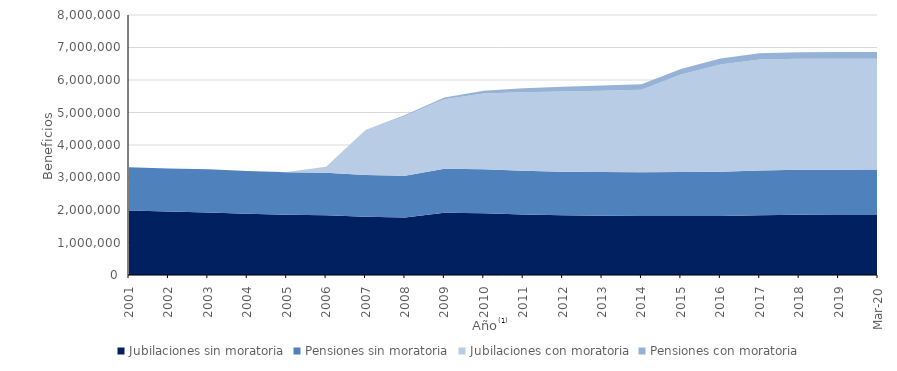
| Category | Jubilaciones sin moratoria | Pensiones sin moratoria | Jubilaciones con moratoria | Pensiones con moratoria |
|---|---|---|---|---|
| 2001.0 | 1984588 | 1327098 | 0 | 0 |
| 2002.0 | 1953410 | 1327077 | 0 | 0 |
| 2003.0 | 1925531 | 1327478 | 0 | 0 |
| 2004.0 | 1881671 | 1319835 | 0 | 0 |
| 2005.0 | 1852155 | 1308369 | 8249 | 0 |
| 2006.0 | 1842055 | 1302065 | 189380 | 536 |
| 2007.0 | 1790012 | 1285210 | 1377788 | 7345 |
| 2008.0 | 1771744 | 1283423 | 1839418 | 24810 |
| 2009.0 | 1916020 | 1353042 | 2137646 | 54755 |
| 2010.0 | 1899422 | 1357224 | 2324976 | 90525 |
| 2011.0 | 1865138 | 1345193 | 2416197 | 122329 |
| 2012.0 | 1839913 | 1334918 | 2469455 | 148526 |
| 2013.0 | 1826653 | 1339222 | 2505563 | 162568 |
| 2014.0 | 1818718 | 1345246 | 2539028 | 169686 |
| 2015.0 | 1814622 | 1352099 | 3000780 | 174686 |
| 2016.0 | 1818030 | 1362099 | 3293148 | 184629 |
| 2017.0 | 1839491 | 1377609 | 3410195 | 196656 |
| 2018.0 | 1852047 | 1385404 | 3413909 | 203133 |
| 2019.0 | 1849453 | 1389261 | 3417399 | 206949 |
| 43891.0 | 1847993 | 1395377 | 3411733 | 209602 |